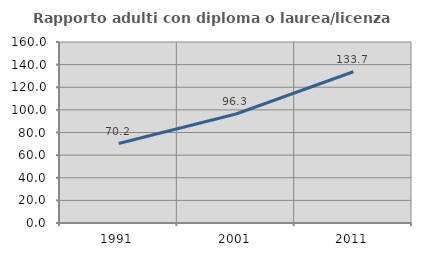
| Category | Rapporto adulti con diploma o laurea/licenza media  |
|---|---|
| 1991.0 | 70.231 |
| 2001.0 | 96.324 |
| 2011.0 | 133.687 |